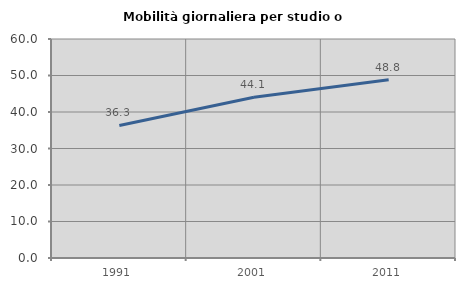
| Category | Mobilità giornaliera per studio o lavoro |
|---|---|
| 1991.0 | 36.306 |
| 2001.0 | 44.065 |
| 2011.0 | 48.815 |